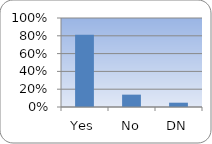
| Category | Series 0 |
|---|---|
| Yes | 0.813 |
| No | 0.139 |
| DN | 0.048 |